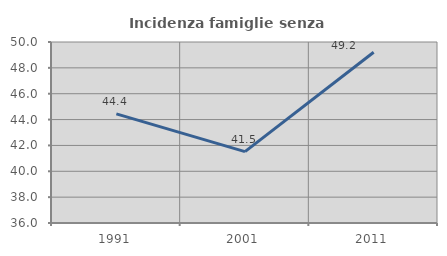
| Category | Incidenza famiglie senza nuclei |
|---|---|
| 1991.0 | 44.444 |
| 2001.0 | 41.518 |
| 2011.0 | 49.206 |